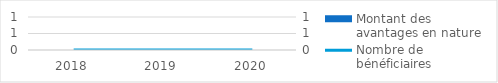
| Category | Montant des avantages en nature |
|---|---|
| 2018.0 | 0 |
| 2019.0 | 0 |
| 2020.0 | 0 |